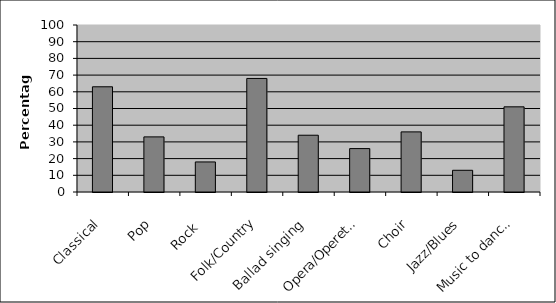
| Category | Series 0 |
|---|---|
| Classical | 63 |
| Pop | 33 |
| Rock  | 18 |
| Folk/Country | 68 |
| Ballad singing | 34 |
| Opera/Operetta | 26 |
| Choir | 36 |
| Jazz/Blues | 13 |
| Music to dance to | 51 |